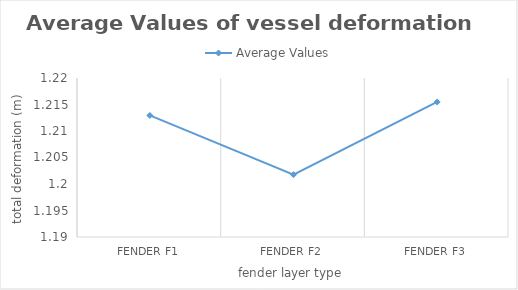
| Category | Average Values |
|---|---|
| Fender F1 | 1.213 |
| Fender F2 | 1.202 |
| Fender F3 | 1.215 |